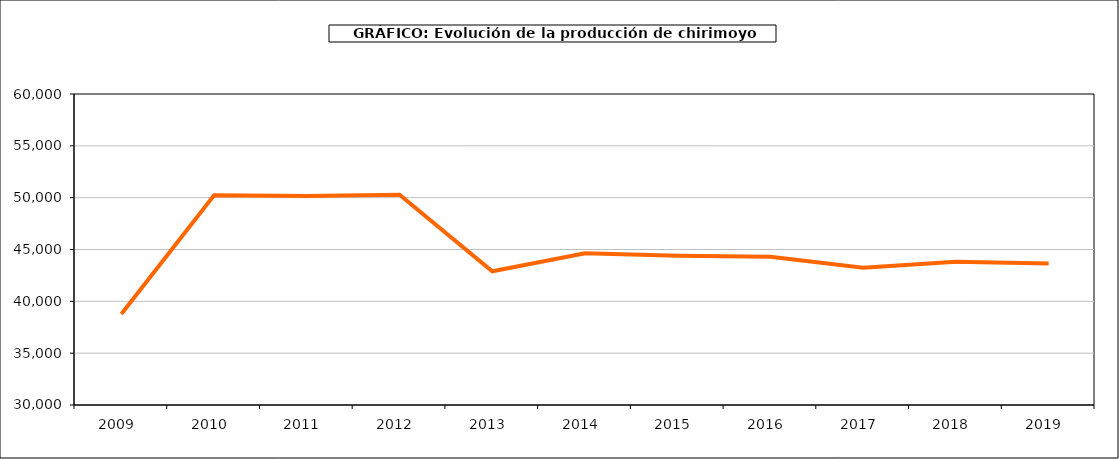
| Category | producción chirimoyo |
|---|---|
| 2009.0 | 38775 |
| 2010.0 | 50241 |
| 2011.0 | 50150 |
| 2012.0 | 50285 |
| 2013.0 | 42898 |
| 2014.0 | 44629 |
| 2015.0 | 44389 |
| 2016.0 | 44305 |
| 2017.0 | 43251 |
| 2018.0 | 43823 |
| 2019.0 | 43645 |